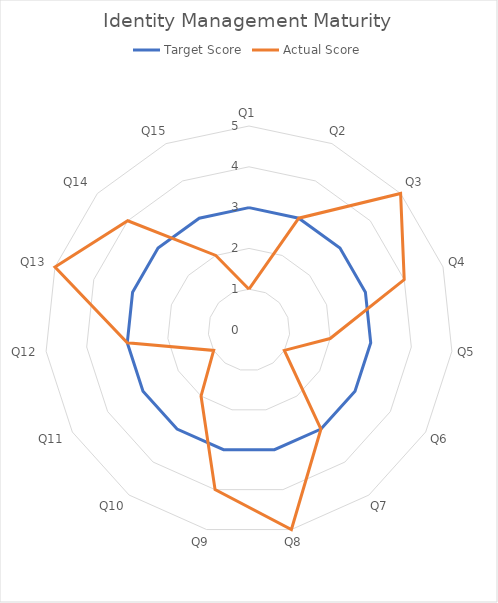
| Category | Target Score | Actual Score |
|---|---|---|
| Q1 | 3 | 1 |
| Q2 | 3 | 3 |
| Q3 | 3 | 5 |
| Q4 | 3 | 4 |
| Q5 | 3 | 2 |
| Q6 | 3 | 1 |
| Q7 | 3 | 3 |
| Q8 | 3 | 5 |
| Q9 | 3 | 4 |
| Q10 | 3 | 2 |
| Q11 | 3 | 1 |
| Q12 | 3 | 3 |
| Q13 | 3 | 5 |
| Q14 | 3 | 4 |
| Q15 | 3 | 2 |